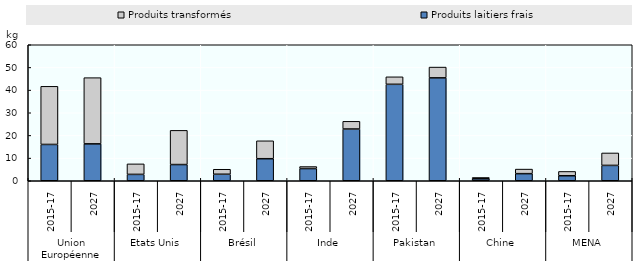
| Category | Produits laitiers frais | Produits transformés |
|---|---|---|
| 0 | 16.02 | 25.648 |
| 1 | 16.277 | 29.211 |
| 2 | 2.812 | 4.639 |
| 3 | 7.148 | 15.086 |
| 4 | 2.872 | 2.208 |
| 5 | 9.726 | 7.903 |
| 6 | 5.381 | 0.886 |
| 7 | 22.828 | 3.397 |
| 8 | 42.552 | 3.304 |
| 9 | 45.399 | 4.752 |
| 10 | 0.868 | 0.578 |
| 11 | 3.132 | 2.013 |
| 12 | 2.212 | 1.903 |
| 13 | 6.774 | 5.494 |